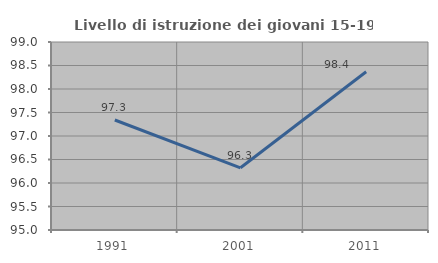
| Category | Livello di istruzione dei giovani 15-19 anni |
|---|---|
| 1991.0 | 97.34 |
| 2001.0 | 96.324 |
| 2011.0 | 98.366 |